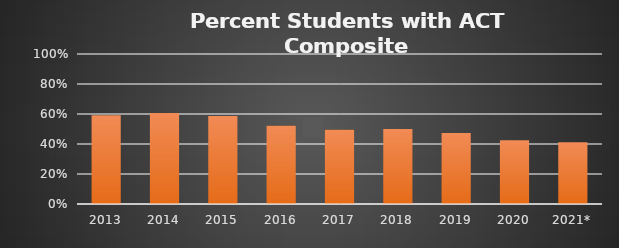
| Category | Series 1 |
|---|---|
| 2013 | 0.591 |
| 2014 | 0.607 |
| 2015 | 0.586 |
| 2016 | 0.522 |
| 2017 | 0.495 |
| 2018 | 0.5 |
| 2019 | 0.473 |
| 2020 | 0.425 |
| 2021* | 0.412 |